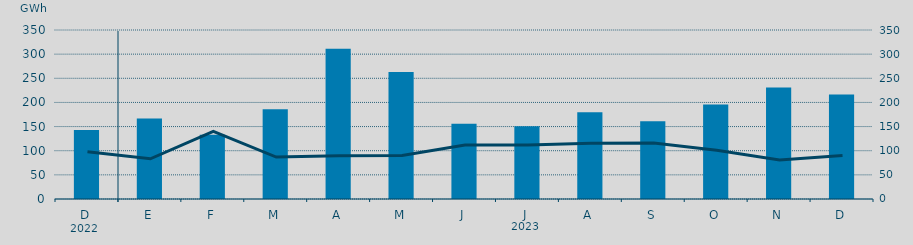
| Category | Energía a subir |
|---|---|
| D | 143.004 |
| E | 166.862 |
| F | 132.923 |
| M | 185.844 |
| A | 310.964 |
| M | 263.086 |
| J | 155.797 |
| J | 150.424 |
| A | 179.728 |
| S | 160.778 |
| O | 195.651 |
| N | 230.778 |
| D | 216.309 |